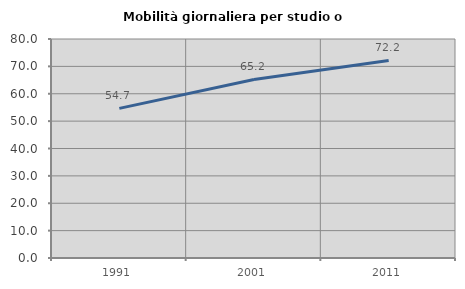
| Category | Mobilità giornaliera per studio o lavoro |
|---|---|
| 1991.0 | 54.653 |
| 2001.0 | 65.226 |
| 2011.0 | 72.154 |